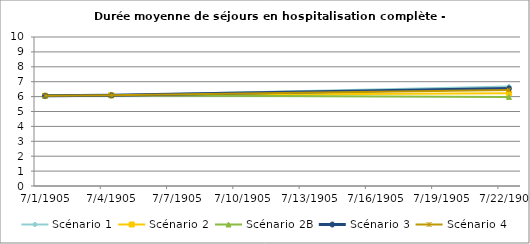
| Category | Scénario 1 | Scénario 2 | Scénario 2B | Scénario 3 | Scénario 4 |
|---|---|---|---|---|---|
| 2009.0 | 6.056 | 6.056 | 6.056 | 6.056 | 6.056 |
| 2012.0 | 6.089 | 6.089 | 6.089 | 6.089 | 6.089 |
| 2030.0 | 6.681 | 6.231 | 5.979 | 6.55 | 6.441 |